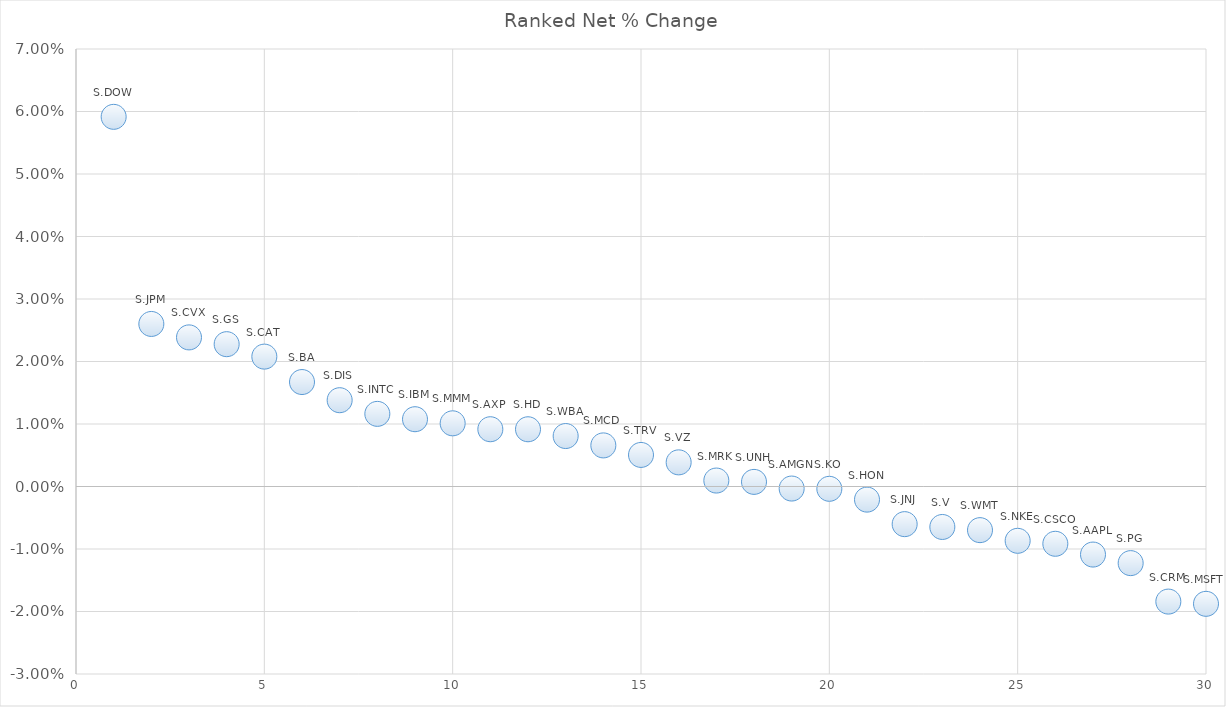
| Category | 5.91% |
|---|---|
| 0 | 0.059 |
| 1 | 0.026 |
| 2 | 0.024 |
| 3 | 0.023 |
| 4 | 0.021 |
| 5 | 0.017 |
| 6 | 0.014 |
| 7 | 0.012 |
| 8 | 0.011 |
| 9 | 0.01 |
| 10 | 0.009 |
| 11 | 0.009 |
| 12 | 0.008 |
| 13 | 0.007 |
| 14 | 0.005 |
| 15 | 0.004 |
| 16 | 0.001 |
| 17 | 0.001 |
| 18 | 0 |
| 19 | 0 |
| 20 | -0.002 |
| 21 | -0.006 |
| 22 | -0.006 |
| 23 | -0.007 |
| 24 | -0.009 |
| 25 | -0.009 |
| 26 | -0.011 |
| 27 | -0.012 |
| 28 | -0.018 |
| 29 | -0.019 |